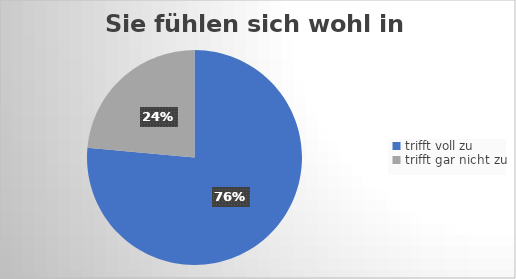
| Category | Sie fühlen sich wohl in Deutschland. |
|---|---|
| trifft voll zu | 214 |
| trifft gar nicht zu | 66 |